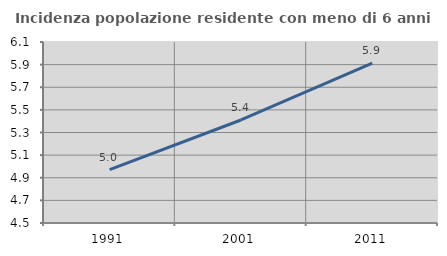
| Category | Incidenza popolazione residente con meno di 6 anni |
|---|---|
| 1991.0 | 4.973 |
| 2001.0 | 5.411 |
| 2011.0 | 5.914 |